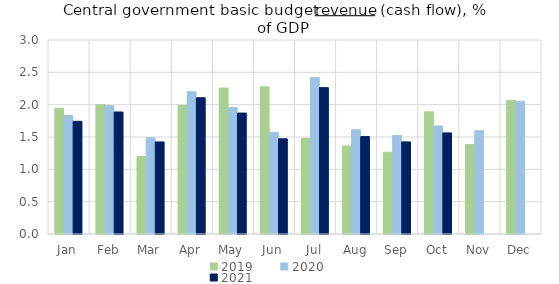
| Category | 2019 | 2020 | 2021 |
|---|---|---|---|
| Jan | 1.946 | 1.833 | 1.743 |
| Feb | 2.001 | 1.984 | 1.887 |
| Mar | 1.196 | 1.487 | 1.424 |
| Apr | 1.991 | 2.2 | 2.107 |
| May | 2.256 | 1.953 | 1.87 |
| Jun | 2.275 | 1.573 | 1.471 |
| Jul | 1.48 | 2.42 | 2.264 |
| Aug | 1.361 | 1.611 | 1.507 |
| Sep | 1.264 | 1.523 | 1.424 |
| Oct | 1.889 | 1.672 | 1.563 |
| Nov | 1.385 | 1.597 | 0 |
| Dec | 2.067 | 2.05 | 0 |